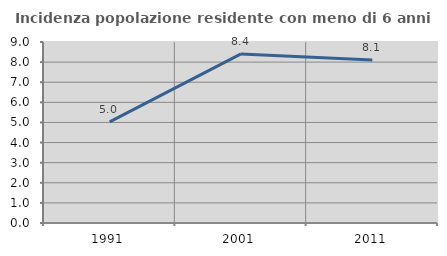
| Category | Incidenza popolazione residente con meno di 6 anni |
|---|---|
| 1991.0 | 5.025 |
| 2001.0 | 8.407 |
| 2011.0 | 8.108 |